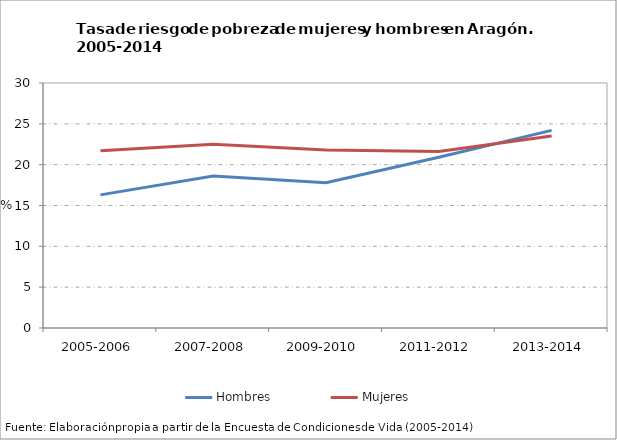
| Category | Hombres | Mujeres |
|---|---|---|
| 2005-2006 | 16.3 | 21.7 |
| 2007-2008 | 18.6 | 22.5 |
| 2009-2010 | 17.8 | 21.8 |
| 2011-2012 | 20.9 | 21.6 |
| 2013-2014 | 24.2 | 23.5 |